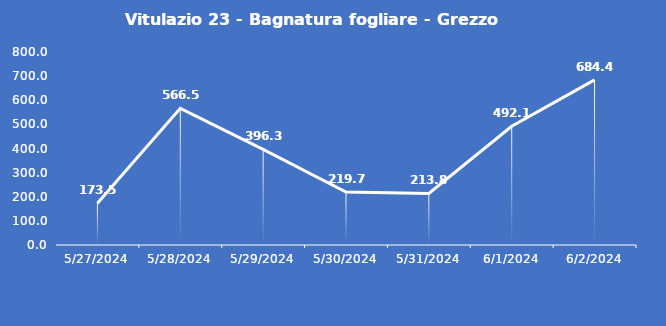
| Category | Vitulazio 23 - Bagnatura fogliare - Grezzo (min) |
|---|---|
| 5/27/24 | 173.5 |
| 5/28/24 | 566.5 |
| 5/29/24 | 396.3 |
| 5/30/24 | 219.7 |
| 5/31/24 | 213.8 |
| 6/1/24 | 492.1 |
| 6/2/24 | 684.4 |